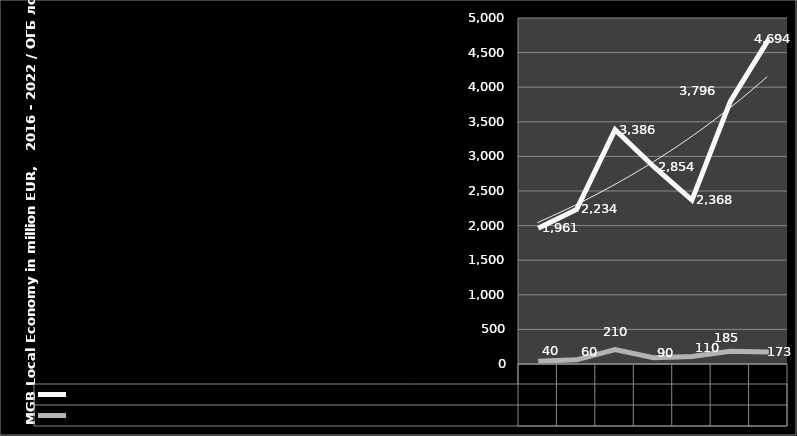
| Category | Turnover in local economy in EUR / Обрт во локалната економија | Profit in Local economy in EUR / Профит во локалната економија |
|---|---|---|
| 2016.0 | 1961 | 40 |
| 2017.0 | 2234 | 60 |
| 2018.0 | 3386 | 210 |
| 2019.0 | 2854 | 90 |
| 2020.0 | 2368 | 110 |
| 2021.0 | 3796 | 185 |
| 2022.0 | 4694 | 173 |